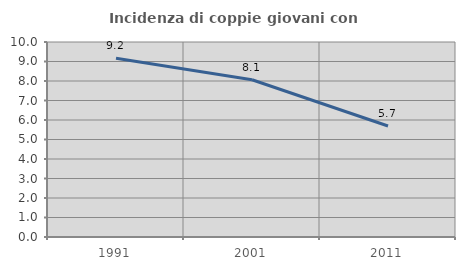
| Category | Incidenza di coppie giovani con figli |
|---|---|
| 1991.0 | 9.167 |
| 2001.0 | 8.065 |
| 2011.0 | 5.691 |